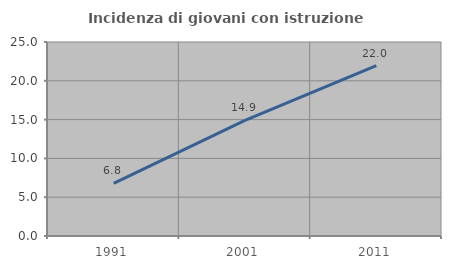
| Category | Incidenza di giovani con istruzione universitaria |
|---|---|
| 1991.0 | 6.784 |
| 2001.0 | 14.904 |
| 2011.0 | 21.951 |